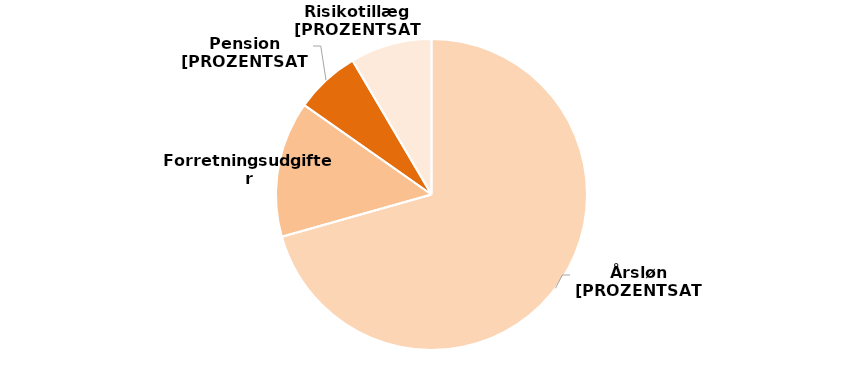
| Category | Series 0 |
|---|---|
| 0 | 500000 |
| 1 | 100000 |
| 2 | 48000 |
| 3 | 60000 |